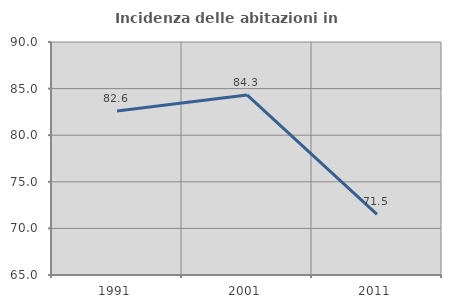
| Category | Incidenza delle abitazioni in proprietà  |
|---|---|
| 1991.0 | 82.593 |
| 2001.0 | 84.322 |
| 2011.0 | 71.495 |